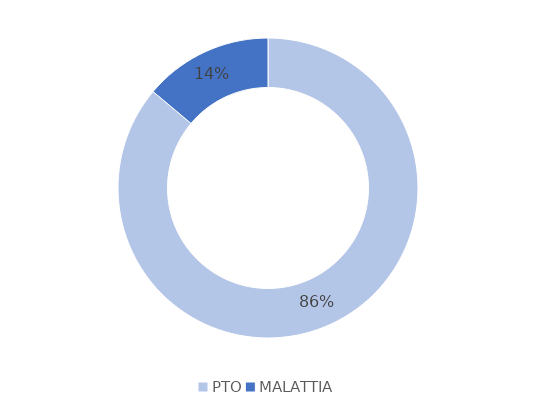
| Category | Series 0 |
|---|---|
| PTO | 31 |
| MALATTIA | 5 |